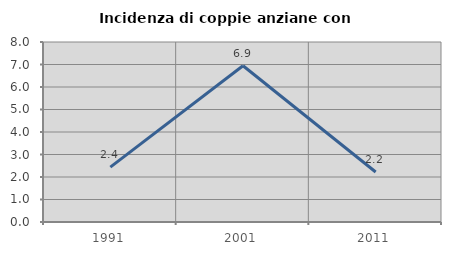
| Category | Incidenza di coppie anziane con figli |
|---|---|
| 1991.0 | 2.439 |
| 2001.0 | 6.944 |
| 2011.0 | 2.222 |